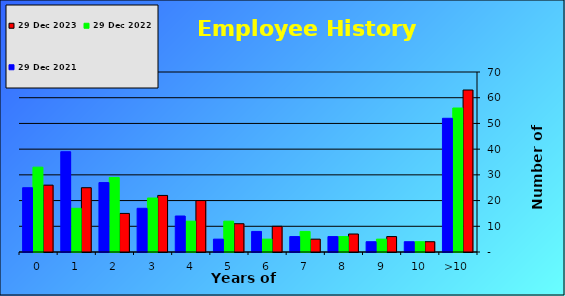
| Category | 29 Dec 2023 | 29 Dec 2022 | 29 Dec 2021 |
|---|---|---|---|
| >10 | 63 | 56 | 52 |
| 10 | 4 | 4 | 4 |
| 9 | 6 | 5 | 4 |
| 8 | 7 | 6 | 6 |
| 7 | 5 | 8 | 6 |
| 6 | 10 | 5 | 8 |
| 5 | 11 | 12 | 5 |
| 4 | 20 | 12 | 14 |
| 3 | 22 | 21 | 17 |
| 2 | 15 | 29 | 27 |
| 1 | 25 | 17 | 39 |
| 0 | 26 | 33 | 25 |